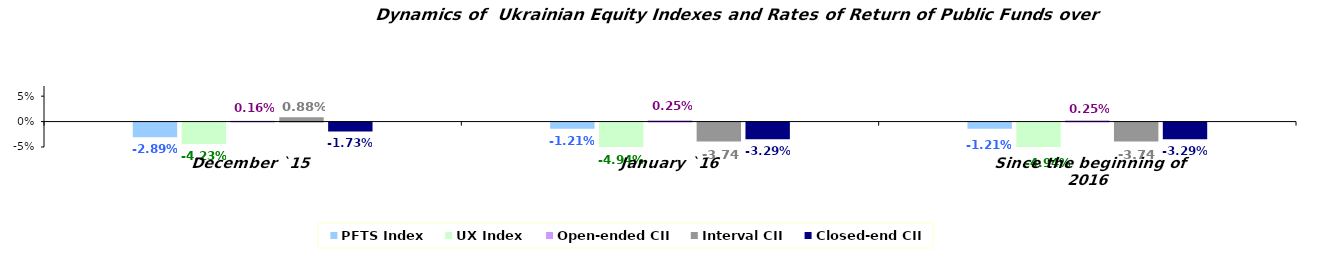
| Category | PFTS Index | UX Index | Open-ended CII | Interval CII | Closed-end CII |
|---|---|---|---|---|---|
| December `15 | -0.029 | -0.042 | 0.002 | 0.009 | -0.017 |
| January `16 | -0.012 | -0.049 | 0.002 | -0.037 | -0.033 |
| Since the beginning of 2016 | -0.012 | -0.049 | 0.002 | -0.037 | -0.033 |